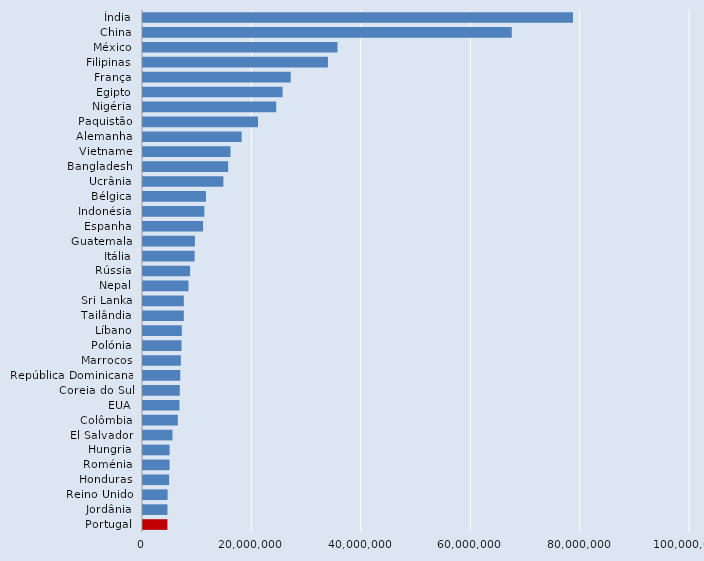
| Category | Series 0 |
|---|---|
| Índia | 78609170.432 |
| China | 67413594.112 |
| México | 35561611.008 |
| Filipinas | 33808970.24 |
| França | 27011081.024 |
| Egipto | 25515700.224 |
| Nigéria | 24356146.131 |
| Paquistão | 21021999.232 |
| Alemanha | 18034549.168 |
| Vietname | 16000000 |
| Bangladesh | 15562379.52 |
| Ucrânia | 14693999.616 |
| Bélgica | 11505420.224 |
| Indonésia | 11211910.368 |
| Espanha | 10985875.2 |
| Guatemala | 9490600.416 |
| Itália | 9443089.92 |
| Rússia | 8610210.048 |
| Nepal | 8316186.428 |
| Sri Lanka | 7465619.987 |
| Tailândia | 7463329.92 |
| Líbano | 7093484.894 |
| Polónia | 7043000.064 |
| Marrocos | 6918199.808 |
| República Dominicana | 6814199.808 |
| Coreia do Sul | 6722700.16 |
| EUA | 6668000.256 |
| Colômbia | 6367490.048 |
| El Salvador | 5388140.16 |
| Hungria | 4860160.128 |
| Roménia | 4856430.08 |
| Honduras | 4776549.824 |
| Reino Unido | 4498890.112 |
| Jordânia | 4470139.904 |
| Portugal | 4469808.384 |